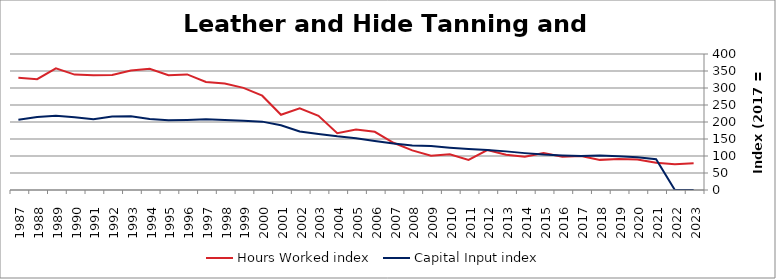
| Category | Hours Worked index | Capital Input index |
|---|---|---|
| 2023.0 | 78.335 | 0 |
| 2022.0 | 75.6 | 0 |
| 2021.0 | 80.49 | 90.623 |
| 2020.0 | 89.511 | 96.61 |
| 2019.0 | 91.091 | 99.556 |
| 2018.0 | 88.61 | 101.269 |
| 2017.0 | 100 | 100 |
| 2016.0 | 97.593 | 101.573 |
| 2015.0 | 108.771 | 104.357 |
| 2014.0 | 97.753 | 108.45 |
| 2013.0 | 103.771 | 113.606 |
| 2012.0 | 117.382 | 117.792 |
| 2011.0 | 88.354 | 120.762 |
| 2010.0 | 104.809 | 124.447 |
| 2009.0 | 100.754 | 129.339 |
| 2008.0 | 116.426 | 130.957 |
| 2007.0 | 138.889 | 136.743 |
| 2006.0 | 171.162 | 144.447 |
| 2005.0 | 178.003 | 152.416 |
| 2004.0 | 167.187 | 157.803 |
| 2003.0 | 218.157 | 164.505 |
| 2002.0 | 240.072 | 172.142 |
| 2001.0 | 221.352 | 190.463 |
| 2000.0 | 277.385 | 201.085 |
| 1999.0 | 300.307 | 203.635 |
| 1998.0 | 313.219 | 206.093 |
| 1997.0 | 317.788 | 207.871 |
| 1996.0 | 339.996 | 205.991 |
| 1995.0 | 337.724 | 205.162 |
| 1994.0 | 356.506 | 208.991 |
| 1993.0 | 351.186 | 216.985 |
| 1992.0 | 338.394 | 215.888 |
| 1991.0 | 337.158 | 208.174 |
| 1990.0 | 339.479 | 214.048 |
| 1989.0 | 357.576 | 218.237 |
| 1988.0 | 326.1 | 214.817 |
| 1987.0 | 330.008 | 206.594 |